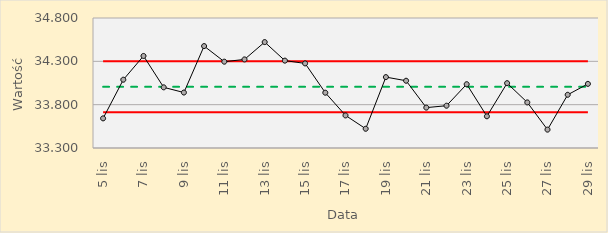
| Category | Series 0 | Series 1 | Series 2 | Series 3 |
|---|---|---|---|---|
| 2020-11-05 | 34.006 | 34.302 | 33.711 | 33.642 |
| 2020-11-06 | 34.006 | 34.302 | 33.711 | 34.088 |
| 2020-11-07 | 34.006 | 34.302 | 33.711 | 34.362 |
| 2020-11-08 | 34.006 | 34.302 | 33.711 | 34 |
| 2020-11-09 | 34.006 | 34.302 | 33.711 | 33.94 |
| 2020-11-10 | 34.006 | 34.302 | 33.711 | 34.476 |
| 2020-11-11 | 34.006 | 34.302 | 33.711 | 34.296 |
| 2020-11-12 | 34.006 | 34.302 | 33.711 | 34.322 |
| 2020-11-13 | 34.006 | 34.302 | 33.711 | 34.522 |
| 2020-11-14 | 34.006 | 34.302 | 33.711 | 34.308 |
| 2020-11-15 | 34.006 | 34.302 | 33.711 | 34.276 |
| 2020-11-16 | 34.006 | 34.302 | 33.711 | 33.938 |
| 2020-11-17 | 34.006 | 34.302 | 33.711 | 33.676 |
| 2020-11-18 | 34.006 | 34.302 | 33.711 | 33.522 |
| 2020-11-19 | 34.006 | 34.302 | 33.711 | 34.118 |
| 2020-11-20 | 34.006 | 34.302 | 33.711 | 34.076 |
| 2020-11-21 | 34.006 | 34.302 | 33.711 | 33.766 |
| 2020-11-22 | 34.006 | 34.302 | 33.711 | 33.788 |
| 2020-11-23 | 34.006 | 34.302 | 33.711 | 34.036 |
| 2020-11-24 | 34.006 | 34.302 | 33.711 | 33.666 |
| 2020-11-25 | 34.006 | 34.302 | 33.711 | 34.048 |
| 2020-11-26 | 34.006 | 34.302 | 33.711 | 33.826 |
| 2020-11-27 | 34.006 | 34.302 | 33.711 | 33.512 |
| 2020-11-28 | 34.006 | 34.302 | 33.711 | 33.914 |
| 2020-11-29 | 34.006 | 34.302 | 33.711 | 34.04 |